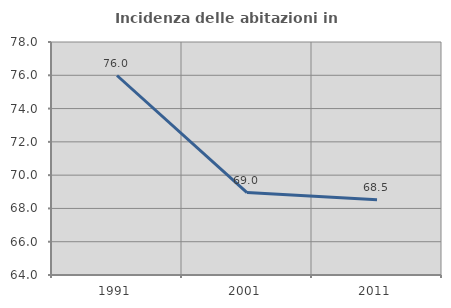
| Category | Incidenza delle abitazioni in proprietà  |
|---|---|
| 1991.0 | 75.987 |
| 2001.0 | 68.955 |
| 2011.0 | 68.524 |